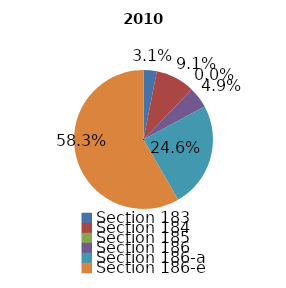
| Category | 2010 |
|---|---|
| Section 183 | 18113351 |
| Section 184 | 53658016 |
| Section 185 | 29836 |
| Section 186 | 29087864 |
| Section 186-a | 144715550 |
| Section 186-e | 343215874 |